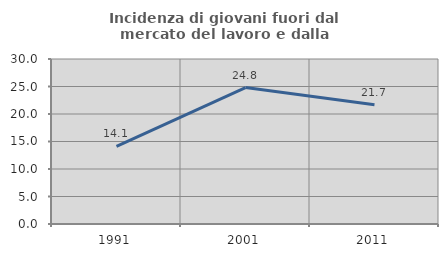
| Category | Incidenza di giovani fuori dal mercato del lavoro e dalla formazione  |
|---|---|
| 1991.0 | 14.103 |
| 2001.0 | 24.8 |
| 2011.0 | 21.667 |